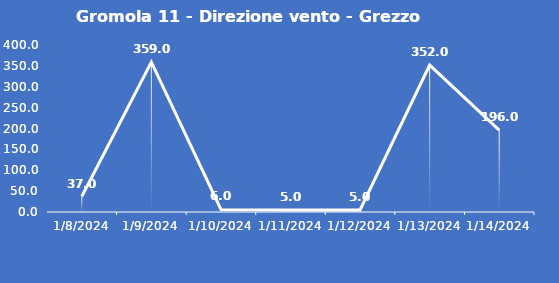
| Category | Gromola 11 - Direzione vento - Grezzo (°N) |
|---|---|
| 1/8/24 | 37 |
| 1/9/24 | 359 |
| 1/10/24 | 6 |
| 1/11/24 | 5 |
| 1/12/24 | 5 |
| 1/13/24 | 352 |
| 1/14/24 | 196 |